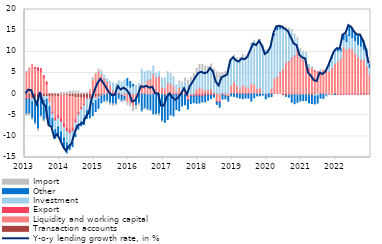
| Category | Transaction accounts | Liquidity and working capital | Export | Investment | Other | Import |
|---|---|---|---|---|---|---|
| 2013-01-01 | -0.509 | 5.346 | -0.651 | 0.035 | -3.527 | -0.631 |
| 2013-02-01 | -0.821 | 6.175 | -0.351 | -0.023 | -3.409 | -0.646 |
| 2013-03-01 | -0.908 | 7.001 | -0.174 | -0.723 | -3.937 | -0.472 |
| 2013-04-01 | -0.906 | 6.112 | 0.185 | -0.925 | -5.053 | -0.444 |
| 2013-05-01 | -1.029 | 5.646 | 0.559 | -1.342 | -5.854 | -0.539 |
| 2013-06-01 | -0.716 | 5.428 | 0.583 | -0.326 | -4.122 | -0.465 |
| 2013-07-01 | -0.657 | 3.831 | 0.52 | -0.86 | -4.6 | -0.517 |
| 2013-08-01 | -0.572 | 2.418 | 0.469 | -0.651 | -4.434 | -0.212 |
| 2013-09-01 | -0.598 | -1.548 | 0.045 | -0.867 | -4.321 | -0.175 |
| 2013-10-01 | -0.733 | -3.459 | -0.474 | -1.128 | -2.012 | -0.04 |
| 2013-11-01 | -0.535 | -5.055 | -0.691 | -2.126 | -2.01 | 0.027 |
| 2013-12-01 | -0.633 | -4.306 | -0.786 | -2.057 | -1.833 | 0.034 |
| 2014-01-01 | -0.249 | -5.51 | -0.913 | -2.28 | -2.331 | 0.385 |
| 2014-02-01 | -0.245 | -6.706 | -0.958 | -2.451 | -2.503 | 0.391 |
| 2014-03-01 | -0.313 | -7.671 | -0.905 | -2.684 | -2.321 | 0.414 |
| 2014-04-01 | -0.6 | -7.826 | -0.87 | -2.823 | -1.007 | 0.607 |
| 2014-05-01 | -0.68 | -7.28 | -0.828 | -2.67 | -0.986 | 0.678 |
| 2014-06-01 | -0.892 | -5.114 | -0.756 | -2.794 | -0.48 | 0.658 |
| 2014-07-01 | -0.864 | -3.398 | -0.666 | -2.577 | -0.783 | 0.724 |
| 2014-08-01 | -1.007 | -2.138 | -0.462 | -2.97 | -0.949 | 0.304 |
| 2014-09-01 | -1.025 | -1.314 | -0.371 | -3.064 | -1.444 | 0.273 |
| 2014-10-01 | -0.822 | 0.079 | -0.337 | -2.797 | -1.737 | 0.282 |
| 2014-11-01 | -0.861 | 0.626 | -0.276 | -2.118 | -2.339 | 0.492 |
| 2014-12-01 | -0.58 | 3.218 | -0.262 | -1.376 | -2.832 | 0.715 |
| 2015-01-01 | -0.714 | 4.647 | -0.14 | -0.735 | -2.54 | 0.363 |
| 2015-02-01 | -0.566 | 5.315 | -0.109 | -0.44 | -2.264 | 0.58 |
| 2015-03-01 | -0.435 | 4.615 | 0.01 | 0.628 | -1.638 | 0.315 |
| 2015-04-01 | -0.176 | 3.558 | 0.045 | 0.803 | -1.506 | -0.203 |
| 2015-05-01 | -0.054 | 2.904 | 0.069 | 0.614 | -1.521 | -0.587 |
| 2015-06-01 | 0.05 | 1.948 | 0.064 | 0.883 | -2.136 | -0.557 |
| 2015-07-01 | 0.129 | 0.588 | 0.07 | 1.82 | -2.288 | -0.686 |
| 2015-08-01 | 0.104 | 0.076 | -0.066 | 2.257 | -2.261 | -0.38 |
| 2015-09-01 | 0.113 | 0.321 | -0.054 | 2.713 | -1.044 | -0.289 |
| 2015-10-01 | 0.038 | -0.248 | -0.058 | 2.851 | -1.314 | -0.292 |
| 2015-11-01 | 0.131 | -0.528 | -0.074 | 3.164 | -0.796 | -0.512 |
| 2015-12-01 | 0.06 | -2.064 | 0.009 | 2.012 | 1.582 | -0.668 |
| 2016-01-01 | 0.112 | -2.142 | -0.029 | 1.532 | 1.328 | -0.779 |
| 2016-02-01 | 0.086 | -2.986 | 0.005 | 1.839 | 0.394 | -1.2 |
| 2016-03-01 | 0.054 | -0.971 | -0.022 | 1.969 | -1.7 | -0.971 |
| 2016-04-01 | 0.002 | 0.443 | -0.024 | 2.055 | -2.16 | -0.577 |
| 2016-05-01 | -0.049 | 2.379 | -0.014 | 3.512 | -3.923 | -0.208 |
| 2016-06-01 | -0.049 | 2.113 | 0.004 | 3.111 | -3.293 | -0.268 |
| 2016-07-01 | -0.188 | 3.113 | 0.004 | 2.467 | -3.427 | -0.165 |
| 2016-08-01 | -0.222 | 3.414 | 0.003 | 2.014 | -3.55 | -0.262 |
| 2016-09-01 | -0.107 | 4.67 | 0.003 | 1.96 | -4.701 | -0.211 |
| 2016-10-01 | -0.069 | 3.806 | 0.02 | 1.146 | -4.647 | -0.197 |
| 2016-11-01 | 0.003 | 4.055 | 0.117 | 1.124 | -4.666 | -0.598 |
| 2016-12-01 | -0.127 | 1.511 | 0.069 | 2.236 | -6.202 | -0.334 |
| 2017-01-01 | -0.288 | 1.276 | 0.033 | 2.51 | -6.392 | 0.022 |
| 2017-02-01 | -0.028 | 2.51 | 0.032 | 2.398 | -6.003 | 0.333 |
| 2017-03-01 | -0.213 | 2.477 | -0.061 | 2.225 | -4.662 | 0.246 |
| 2017-04-01 | 0.006 | 1.831 | -0.118 | 2.184 | -5.039 | 0.13 |
| 2017-05-01 | -0.021 | 0.475 | -0.132 | 1.499 | -3.493 | 0.207 |
| 2017-06-01 | -0.058 | 1.481 | -0.147 | 1.097 | -3.76 | 0.505 |
| 2017-07-01 | 0.066 | 0.598 | -0.146 | 1.924 | -2.666 | 0.256 |
| 2017-08-01 | 0.095 | 0.943 | -0.148 | 1.877 | -2.402 | 0.88 |
| 2017-09-01 | -0.033 | -1.152 | -0.337 | 2.19 | -2.013 | 1.113 |
| 2017-10-01 | 0.036 | -0.151 | -0.348 | 2.896 | -1.739 | 1.06 |
| 2017-11-01 | -0.038 | 0.038 | -0.42 | 3.24 | -1.584 | 1.591 |
| 2017-12-01 | 0.112 | 0.977 | -0.469 | 3.609 | -1.704 | 1.433 |
| 2018-01-01 | -0.017 | 1.525 | -0.446 | 4.005 | -1.648 | 1.463 |
| 2018-02-01 | -0.077 | 1.237 | -0.443 | 4.341 | -1.342 | 1.444 |
| 2018-03-01 | 0.182 | 0.819 | -0.351 | 4.376 | -1.49 | 1.268 |
| 2018-04-01 | 0.071 | 0.951 | -0.295 | 4.091 | -1.173 | 1.367 |
| 2018-05-01 | 0.137 | 1.093 | -0.294 | 4.306 | -0.764 | 1.557 |
| 2018-06-01 | 0.285 | -0.027 | -0.275 | 4.466 | -0.403 | 1.177 |
| 2018-07-01 | 0.145 | -1.649 | -0.279 | 3.416 | -0.5 | 1.678 |
| 2018-08-01 | 0.047 | -1.673 | -0.275 | 3.718 | -1.158 | 1.273 |
| 2018-09-01 | 0.188 | -0.104 | -0.087 | 3.905 | -0.993 | 0.959 |
| 2018-10-01 | 0.166 | -0.346 | -0.086 | 4.215 | -0.685 | 0.9 |
| 2018-11-01 | 0.152 | -0.467 | -0.083 | 5.676 | -1.111 | 0.383 |
| 2018-12-01 | 0.122 | 1.844 | 0.005 | 5.631 | -0.459 | 0.689 |
| 2019-01-01 | 0.084 | 2.809 | 0.003 | 5.72 | -0.538 | 0.514 |
| 2019-02-01 | 0.122 | 1.928 | -0.001 | 6.03 | -0.717 | 0.484 |
| 2019-03-01 | -0.044 | 1.247 | -0.007 | 6.358 | -0.896 | 0.926 |
| 2019-04-01 | -0.017 | 2.07 | -0.007 | 6.386 | -1.065 | 0.967 |
| 2019-05-01 | -0.066 | 1.735 | -0.007 | 6.75 | -0.885 | 0.592 |
| 2019-06-01 | 0.072 | 1.417 | -0.011 | 7.589 | -0.96 | 0.595 |
| 2019-07-01 | 0.175 | 2.37 | 0 | 8.94 | -1.675 | 0.572 |
| 2019-08-01 | 0.115 | 2.145 | 0 | 10.213 | -0.883 | 0.24 |
| 2019-09-01 | 0.013 | 1.238 | 0 | 10.45 | -0.43 | 0.208 |
| 2019-10-31 | -0.067 | 1.466 | 0 | 11.018 | -0.348 | 0.437 |
| 2019-11-30 | -0.092 | 0.018 | 0 | 10.735 | -0.147 | 0.838 |
| 2019-12-31 | -0.113 | -0.095 | -0.01 | 10.083 | -0.903 | 0.405 |
| 2020-01-31 | 0.054 | 0.059 | -0.01 | 9.891 | -0.685 | 0.53 |
| 2020-02-29 | -0.039 | 1.299 | -0.005 | 9.955 | -0.565 | 0.478 |
| 2020-03-31 | 0.143 | 3.547 | 0 | 10.309 | 0.133 | 0.222 |
| 2020-04-30 | 0.161 | 4.038 | 0 | 11.011 | 0.549 | 0.149 |
| 2020-05-31 | -0.035 | 5.152 | 0.005 | 10.317 | 0.3 | 0.307 |
| 2020-06-30 | -0.384 | 6.013 | 0.022 | 9.514 | 0.217 | 0.411 |
| 2020-07-31 | -0.392 | 7.446 | 0.075 | 8.114 | -0.133 | 0.198 |
| 2020-08-31 | -0.213 | 7.716 | 0.074 | 7.318 | -0.516 | 0.452 |
| 2020-09-30 | -0.278 | 8.503 | 0.072 | 6.149 | -1.624 | 0.502 |
| 2020-10-31 | -0.211 | 9.07 | 0.061 | 4.594 | -2.063 | 0.411 |
| 2020-11-30 | -0.2 | 10.314 | 0.062 | 2.62 | -1.728 | 0.415 |
| 2020-12-31 | -0.292 | 8.616 | 0.053 | 1.664 | -1.309 | 0.43 |
| 2021-01-31 | -0.189 | 8.023 | 0.055 | 1.685 | -1.365 | 0.342 |
| 2021-02-28 | -0.183 | 7.754 | 0.056 | 1.663 | -1.361 | 0.376 |
| 2021-03-31 | -0.284 | 6.169 | 0.054 | 0.542 | -1.745 | 0.241 |
| 2021-04-30 | -0.379 | 6.185 | 0.054 | 0.072 | -1.88 | 0.155 |
| 2021-05-31 | -0.226 | 5.456 | 0.046 | -0.255 | -1.842 | 0.02 |
| 2021-06-30 | -0.026 | 5.2 | 0.026 | -0.364 | -1.767 | -0.11 |
| 2021-07-31 | 0.058 | 5.332 | -0.031 | 0.248 | -0.939 | 0.271 |
| 2021-08-31 | -0.054 | 5.613 | -0.031 | -0.076 | -0.866 | 0.055 |
| 2021-09-30 | 0.036 | 5.791 | -0.031 | -0.212 | -0.159 | -0.232 |
| 2021-10-31 | -0.053 | 5.393 | -0.023 | 1.348 | 0.159 | -0.225 |
| 2021-11-30 | -0.072 | 6.304 | -0.029 | 2.287 | 0.103 | -0.183 |
| 2021-12-31 | 0.061 | 7.169 | -0.041 | 2.832 | -0.06 | 0.046 |
| 2022-01-31 | -0.021 | 7.681 | -0.05 | 2.555 | 0.523 | 0.055 |
| 2022-02-28 | -0.052 | 8.431 | -0.051 | 1.755 | 0.546 | 0.016 |
| 2022-03-31 | -0.028 | 11.071 | -0.051 | 1.909 | 0.888 | 0.169 |
| 2022-04-30 | 0.039 | 10.428 | -0.051 | 1.966 | 1.643 | 0.328 |
| 2022-05-31 | 0.154 | 10.704 | -0.049 | 2.956 | 2.006 | 0.425 |
| 2022-06-30 | 0.044 | 10.632 | -0.044 | 2.65 | 1.934 | 0.514 |
| 2022-07-31 | 0.18 | 9.446 | -0.032 | 3.005 | 1.851 | 0.186 |
| 2022-08-31 | 0.263 | 8.447 | -0.032 | 3.101 | 2.001 | 0.187 |
| 2022-09-30 | 0.24 | 7.997 | -0.031 | 3.114 | 2.176 | 0.46 |
| 2022-10-31 | 0.261 | 7.869 | -0.03 | 2.485 | 1.628 | 0.448 |
| 2022-11-30 | 0.255 | 6.325 | -0.024 | 2.471 | 1.325 | 0.369 |
| 2022-12-31 | 0.244 | 4.37 | -0.007 | 1.734 | 0.617 | 0.188 |